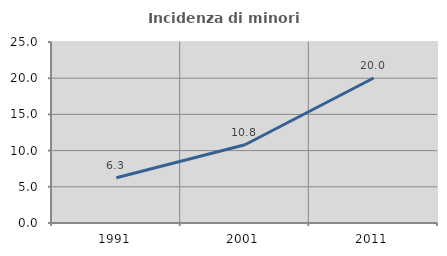
| Category | Incidenza di minori stranieri |
|---|---|
| 1991.0 | 6.25 |
| 2001.0 | 10.811 |
| 2011.0 | 20.032 |